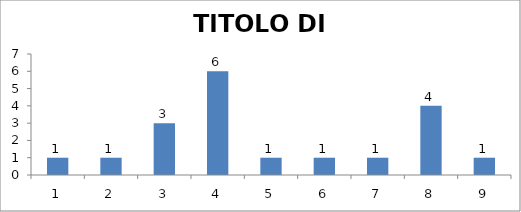
| Category | TITOLO DI STUDIO |
|---|---|
| 0 | 1 |
| 1 | 1 |
| 2 | 3 |
| 3 | 6 |
| 4 | 1 |
| 5 | 1 |
| 6 | 1 |
| 7 | 4 |
| 8 | 1 |